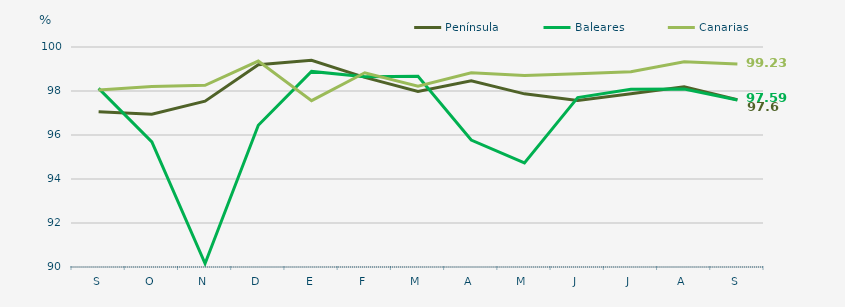
| Category | Península | Baleares | Canarias |
|---|---|---|---|
| S | 97.06 | 98.12 | 98.05 |
| O | 96.94 | 95.69 | 98.21 |
| N | 97.54 | 90.16 | 98.26 |
| D | 99.19 | 96.44 | 99.36 |
| E | 99.4 | 98.89 | 97.56 |
| F | 98.62 | 98.65 | 98.83 |
| M | 97.98 | 98.67 | 98.22 |
| A | 98.46 | 95.77 | 98.83 |
| M | 97.87 | 94.73 | 98.7 |
| J | 97.57 | 97.7 | 98.78 |
| J | 97.87 | 98.08 | 98.88 |
| A | 98.19 | 98.09 | 99.33 |
| S | 97.6 | 97.59 | 99.23 |